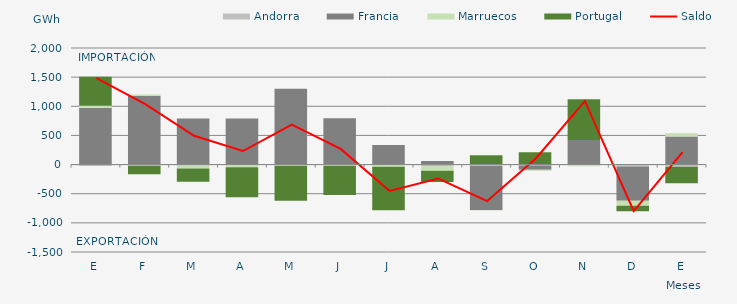
| Category | Andorra | Francia | Marruecos | Portugal |
|---|---|---|---|---|
| E | -24.438 | 973.605 | 35.757 | 497.454 |
| F | -19.197 | 1176.23 | 25.948 | -147.199 |
| M | -22.309 | 789.686 | -47.202 | -226.399 |
| A | -6.988 | 791.615 | -38.41 | -513.779 |
| M | -1.245 | 1302.344 | -18.608 | -598.82 |
| J | -0.008 | 792.83 | -21.038 | -502.886 |
| J | -5.052 | 334.729 | -33.385 | -747.138 |
| A | -26.107 | 60.563 | -80.137 | -193.987 |
| S | -25.668 | -754.78 | -5.797 | 160.618 |
| O | -15.157 | -73.766 | -16.017 | 213.105 |
| N | -14.884 | 423.038 | -15.41 | 698.188 |
| D | -35.076 | -586.843 | -82.554 | -95.842 |
| E | -38.419 | 481.93 | 55.475 | -284.018 |